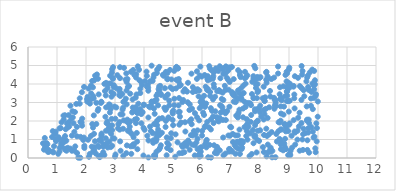
| Category | Series 0 |
|---|---|
| 6.514540313641692 | 0.25 |
| 3.258036223303853 | 2.355 |
| 9.611685176595932 | 2.788 |
| 6.718119250185469 | 2.056 |
| 3.560900860458809 | 0.226 |
| 9.434667183937016 | 4.973 |
| 9.293604395264447 | 1.469 |
| 2.3106375163464357 | 0.904 |
| 9.527382701474306 | 3.335 |
| 8.726764199824812 | 0.893 |
| 5.825327841776408 | 4.685 |
| 3.1801052760502415 | 3.356 |
| 1.8508317692140197 | 1.908 |
| 1000.0 | 1000 |
| 2.7900266712365154 | 1.78 |
| 7.911885719242525 | 3.995 |
| 5.846657293763941 | 3.717 |
| 7.2453509117797 | 2.362 |
| 2.072651007675997 | 0.986 |
| 7.290248872529956 | 2.613 |
| 3.8726823225385285 | 2.642 |
| 2.1349625093110856 | 2.94 |
| 4.938799020726297 | 1.337 |
| 1.2728139878986489 | 0.508 |
| 7.4158468451568815 | 2.201 |
| 1000.0 | 1000 |
| 9.66142939396353 | 1.606 |
| 9.600120747328019 | 4.144 |
| 4.246755495161998 | 2.842 |
| 4.922787181447119 | 1.071 |
| 4.590618096940318 | 3.41 |
| 6.416403614070068 | 3.818 |
| 5.556336335870954 | 0.84 |
| 2.8954090609565775 | 4.62 |
| 1.8686792845479105 | 2.127 |
| 1000.0 | 1000 |
| 2.9628327406106125 | 3.931 |
| 9.04494552154286 | 0.16 |
| 4.452664086378109 | 1.772 |
| 6.681659004231962 | 3.192 |
| 5.825778668973726 | 4.275 |
| 6.379328122886779 | 3.17 |
| 0.579129729845812 | 1.083 |
| 0.6876049098019399 | 0.331 |
| 1000.0 | 1000 |
| 3.871232251648208 | 3.512 |
| 3.8288889218697317 | 4.767 |
| 3.775248777607053 | 2.42 |
| 4.660409793697826 | 4.506 |
| 1000.0 | 1000 |
| 4.454933465504913 | 4.768 |
| 7.1762036709917805 | 0.581 |
| 2.9810257942731 | 1.051 |
| 1000.0 | 1000 |
| 5.003178958912086 | 1.778 |
| 7.9161145641658335 | 1.989 |
| 5.619706045245647 | 1.236 |
| 1000.0 | 1000 |
| 8.925193801852668 | 3.833 |
| 1000.0 | 1000 |
| 5.013668524437431 | 2.569 |
| 1000.0 | 1000 |
| 7.758082436355092 | 1.512 |
| 2.2690806493149953 | 2.302 |
| 3.541358059265891 | 0.631 |
| 7.892898900187163 | 3.235 |
| 1000.0 | 1000 |
| 8.896641847217783 | 0.48 |
| 3.9532553654040594 | 2.474 |
| 6.966066409401218 | 1.207 |
| 1000.0 | 1000 |
| 6.808218139456765 | 0.241 |
| 9.623420101642365 | 2.072 |
| 4.429543796718467 | 3.363 |
| 3.052163067318224 | 3.764 |
| 8.871622594810644 | 3.341 |
| 1000.0 | 1000 |
| 8.632051306754953 | 1.442 |
| 7.502352511373928 | 2.76 |
| 1000.0 | 1000 |
| 6.634056661532679 | 4.312 |
| 2.5329976426552725 | 3.005 |
| 3.740877927754135 | 3.434 |
| 5.686220917137559 | 3.568 |
| 3.3809819670199937 | 2.001 |
| 9.8960376760196 | 3.979 |
| 2.9307054772341754 | 4.279 |
| 8.228029484336398 | 0.088 |
| 2.2506429488890456 | 3.339 |
| 5.685380858201006 | 3.83 |
| 2.1715633291461134 | 1.191 |
| 7.654770253525554 | 1.328 |
| 8.399872269272793 | 1.399 |
| 2.6926859489544466 | 4.063 |
| 4.041003279543859 | 4.158 |
| 1.0608959885048153 | 1.024 |
| 6.711718383214096 | 3.533 |
| 2.454232472207053 | 0.958 |
| 0.8292543904805627 | 1.134 |
| 1.3782073640301062 | 1.663 |
| 6.588337880781211 | 3.66 |
| 3.653043263124766 | 0.73 |
| 9.686106286316482 | 3.676 |
| 8.85359167712618 | 1.797 |
| 1.9267528540206402 | 1.105 |
| 1000.0 | 1000 |
| 5.359114226030945 | 3.595 |
| 2.63489078296532 | 4.007 |
| 3.4679052299274113 | 1.873 |
| 6.1043733892131415 | 2.766 |
| 8.561822941673391 | 1.297 |
| 5.414003402297297 | 0.806 |
| 6.712299307437418 | 4.796 |
| 6.810480057490162 | 4.584 |
| 8.683702296176923 | 1.918 |
| 2.626913685242187 | 0.688 |
| 1000.0 | 1000 |
| 8.12736722713076 | 3.852 |
| 1.4089234324547706 | 1.942 |
| 5.045221637019969 | 3.201 |
| 7.7156233174318825 | 0.215 |
| 5.240193843390656 | 2.237 |
| 9.691128857250453 | 0.289 |
| 2.6246427155748844 | 0.709 |
| 5.506216551615943 | 3.014 |
| 5.848012588612992 | 0.477 |
| 1000.0 | 1000 |
| 4.559511935105263 | 3.897 |
| 7.036706938964193 | 3.558 |
| 7.130024140764714 | 0.681 |
| 6.943980034351408 | 2.769 |
| 8.483028087952224 | 3.253 |
| 2.9015591479718736 | 4.799 |
| 1000.0 | 1000 |
| 7.4375483032000735 | 3.512 |
| 8.507203204080842 | 3.145 |
| 1.3291151319703531 | 0.392 |
| 2.531101460166074 | 0.89 |
| 9.290065904599496 | 0.994 |
| 8.864440213556103 | 1.036 |
| 7.967733605172224 | 2.673 |
| 7.182201013032082 | 2.29 |
| 9.659340068282848 | 3.835 |
| 1000.0 | 1000 |
| 9.848716116556968 | 1.103 |
| 5.218818625873767 | 0.256 |
| 3.6867273387000665 | 2.078 |
| 1.4646692164385788 | 2.824 |
| 7.465627525975101 | 1.674 |
| 1000.0 | 1000 |
| 2.129740435931937 | 0.217 |
| 8.998576381001227 | 4.791 |
| 4.867270504674572 | 3.106 |
| 2.983964614326701 | 2.781 |
| 7.093316455840945 | 4.264 |
| 6.3464652420747765 | 2.548 |
| 9.202016896984315 | 4.42 |
| 6.895471794531911 | 4.239 |
| 6.264222998689867 | 0.707 |
| 1000.0 | 1000 |
| 4.82044853488968 | 4.284 |
| 1.8028459880965542 | 0.014 |
| 7.85060531830029 | 4.259 |
| 4.3543954767927655 | 3.08 |
| 7.063594628770513 | 1.299 |
| 1000.0 | 1000 |
| 1000.0 | 1000 |
| 4.147813707292426 | 3.636 |
| 2.4776869820574277 | 0.047 |
| 5.806915966917377 | 0.843 |
| 9.823055023263779 | 1.429 |
| 8.936965084795968 | 4.582 |
| 4.380535839575199 | 0.068 |
| 0.9544879582097587 | 1.424 |
| 7.914297933571 | 3.554 |
| 6.212698852102766 | 0.043 |
| 4.236206944368406 | 1.456 |
| 3.188035578879046 | 2.36 |
| 1000.0 | 1000 |
| 1000.0 | 1000 |
| 7.968309888299755 | 0.92 |
| 1000.0 | 1000 |
| 4.551455021510849 | 0.545 |
| 1.0871277109977606 | 1.604 |
| 5.93566228334256 | 0.555 |
| 3.6305060942906775 | 0.738 |
| 7.5685874340832395 | 0.99 |
| 8.282125300683639 | 0.318 |
| 5.080129334359851 | 0.069 |
| 8.22695800207018 | 4.066 |
| 4.32745277895061 | 4.357 |
| 5.1900322604879765 | 2.839 |
| 9.183193680717087 | 3.431 |
| 5.044480115368461 | 2.855 |
| 2.8992486127065775 | 1.509 |
| 1.5979403462377006 | 0.397 |
| 3.4015113763620084 | 4.113 |
| 1000.0 | 1000 |
| 7.030300307435878 | 4.919 |
| 5.776724905912203 | 1.266 |
| 4.680318558717148 | 4.443 |
| 0.9331551276336136 | 1.315 |
| 1.0430371045711961 | 0.225 |
| 3.8637399333534272 | 2.529 |
| 3.6200438204071617 | 2.524 |
| 6.163536174882916 | 0.979 |
| 0.7144950208958001 | 0.436 |
| 9.625427176227253 | 4.348 |
| 6.41934125486266 | 4.649 |
| 1000.0 | 1000 |
| 5.485324604742309 | 3.588 |
| 1000.0 | 1000 |
| 6.823739761555845 | 4.953 |
| 6.719900862978956 | 2.555 |
| 6.399390012197944 | 1.888 |
| 2.356510678143986 | 2.981 |
| 4.41154532265295 | 0.905 |
| 6.391364944535076 | 4.423 |
| 5.955075213295808 | 0.116 |
| 9.02473897776195 | 0.224 |
| 1000.0 | 1000 |
| 8.137386755633694 | 2.599 |
| 5.9567739569855895 | 0.341 |
| 3.1718929641161377 | 4.317 |
| 1.7838015784739347 | 2.937 |
| 6.270906933123551 | 4.242 |
| 5.845889803515922 | 1.494 |
| 8.241404398006035 | 1.191 |
| 9.95508216872793 | 0.897 |
| 1000.0 | 1000 |
| 7.095664108203753 | 3.046 |
| 3.4290357937433837 | 4.269 |
| 2.6688865298084496 | 2.229 |
| 6.543294061614979 | 0.499 |
| 4.7025456202294835 | 2.718 |
| 5.301733448824302 | 0.682 |
| 7.247550160782171 | 4.747 |
| 7.545310348943461 | 2.097 |
| 7.307451780532784 | 0.218 |
| 7.332142571232993 | 4.371 |
| 1.4947215984230477 | 2.129 |
| 6.143240497960162 | 2.944 |
| 0.8967386409265554 | 0.636 |
| 2.4368344431937086 | 3.439 |
| 7.664707222498533 | 2.956 |
| 1000.0 | 1000 |
| 6.74054164617933 | 0.146 |
| 2.0352448726717585 | 3.181 |
| 3.71327616995225 | 2.745 |
| 1000.0 | 1000 |
| 9.663890006803909 | 1.373 |
| 6.459865381903898 | 2.526 |
| 3.762144668001416 | 0.885 |
| 3.996319309304331 | 2.882 |
| 8.711038210874376 | 2.017 |
| 3.017206831126984 | 0.191 |
| 9.486145207419945 | 1.288 |
| 4.367661746456171 | 2.389 |
| 3.0806639127640323 | 4.476 |
| 4.798404682042131 | 0.538 |
| 7.860147931615403 | 1.915 |
| 6.3816719039158905 | 2.241 |
| 4.877253682173817 | 2.851 |
| 2.33862078462149 | 0.24 |
| 3.724900766705128 | 2.085 |
| 6.2735918978225405 | 4.832 |
| 5.910648101177124 | 0.074 |
| 9.93043456170236 | 3.444 |
| 4.481147686210333 | 4.812 |
| 9.820999612242465 | 2.643 |
| 5.830470793768743 | 2.202 |
| 1000.0 | 1000 |
| 1000.0 | 1000 |
| 1000.0 | 1000 |
| 7.15447996717555 | 0.226 |
| 5.159745400582453 | 4.833 |
| 2.6915173147839666 | 1.474 |
| 1000.0 | 1000 |
| 8.34470673158056 | 3.625 |
| 6.94182275503053 | 0.347 |
| 4.821484832978177 | 3.435 |
| 5.523232727882823 | 0.945 |
| 9.893856861453509 | 4.202 |
| 5.208489437091116 | 3.242 |
| 1.2806991897897213 | 0.448 |
| 8.224242214543965 | 4.657 |
| 8.64163376453481 | 1.934 |
| 6.038383613097386 | 2.453 |
| 7.7927000005170335 | 4.23 |
| 1.150259706234692 | 0.75 |
| 1000.0 | 1000 |
| 4.302377585368769 | 1.344 |
| 6.631966731170321 | 3.592 |
| 9.679259066702755 | 2.075 |
| 2.043555373403103 | 3.049 |
| 3.7229447155647954 | 1.885 |
| 8.367000429181433 | 0.56 |
| 5.3321003032338705 | 0.599 |
| 1000.0 | 1000 |
| 7.332485757335206 | 0.931 |
| 5.7188539551587105 | 1.453 |
| 6.474273480099159 | 4.844 |
| 1000.0 | 1000 |
| 3.48420569018135 | 3.891 |
| 1000.0 | 1000 |
| 5.750110339120952 | 0.692 |
| 6.976334313948312 | 0.454 |
| 7.371194537192962 | 3.439 |
| 4.098172594941047 | 4.437 |
| 8.852529477733437 | 1.84 |
| 3.410123841095598 | 0.68 |
| 6.954289928328272 | 4.111 |
| 1000.0 | 1000 |
| 7.855765397749956 | 4.257 |
| 5.643888866368334 | 1.824 |
| 9.990744768019354 | 2.231 |
| 1.5128956668273696 | 1.208 |
| 3.93388917086809 | 3.95 |
| 1000.0 | 1000 |
| 5.921630233792862 | 2.695 |
| 2.1725198348733743 | 3.909 |
| 1.3423772247763188 | 1.867 |
| 4.484015765399862 | 2.846 |
| 1000.0 | 1000 |
| 7.776164515706685 | 0.798 |
| 9.19151780647466 | 1.434 |
| 1000.0 | 1000 |
| 4.801627071903875 | 0.823 |
| 9.848113686434678 | 3.927 |
| 9.632829366969023 | 0.435 |
| 9.193343354852173 | 2.681 |
| 4.545725821500337 | 1.291 |
| 9.36594439407828 | 2.445 |
| 5.266191773828888 | 3.949 |
| 7.838992140334514 | 1.197 |
| 1000.0 | 1000 |
| 9.61789981577809 | 2.019 |
| 8.261439886375273 | 4.416 |
| 7.802275845440008 | 4.978 |
| 8.810940513478846 | 2.344 |
| 1000.0 | 1000 |
| 1000.0 | 1000 |
| 5.8448672464615115 | 1.037 |
| 3.6238560780121643 | 0.637 |
| 8.83875381340874 | 0.773 |
| 4.911861901838694 | 3.816 |
| 3.4019592583251033 | 2.901 |
| 5.1930736472680685 | 2.48 |
| 1000.0 | 1000 |
| 8.003325289158044 | 2.466 |
| 3.550955562387773 | 4.66 |
| 5.222423120304373 | 3.892 |
| 4.3803315809945715 | 3.074 |
| 1000.0 | 1000 |
| 2.8749578887028546 | 3.563 |
| 9.00954510703923 | 1.805 |
| 2.2815319103560796 | 4.198 |
| 1.8589885743263257 | 3.555 |
| 7.478890724353494 | 3.027 |
| 5.197220392025122 | 4.268 |
| 7.882079933877385 | 0.3 |
| 4.785195511697403 | 1.115 |
| 8.229990341659354 | 4.204 |
| 9.481755710453035 | 0.436 |
| 1000.0 | 1000 |
| 4.155163877615523 | 0.947 |
| 5.985117269969175 | 2.812 |
| 1000.0 | 1000 |
| 2.4045716868712583 | 2.555 |
| 5.794371801498438 | 3.613 |
| 1000.0 | 1000 |
| 5.100461762520299 | 4.887 |
| 5.517294853772071 | 4.066 |
| 8.62337746160611 | 4.568 |
| 1000.0 | 1000 |
| 9.993747789134206 | 3.054 |
| 4.451363117371424 | 1.339 |
| 1.8653586643806797 | 1.746 |
| 3.3976129104142636 | 3.649 |
| 1.597530083334503 | 1.411 |
| 2.9247422389931224 | 1.069 |
| 3.8044481382731243 | 2.935 |
| 1000.0 | 1000 |
| 2.8454326378790995 | 2.635 |
| 0.6691587948883027 | 0.742 |
| 6.391924342224485 | 4.656 |
| 4.843147185309907 | 2.152 |
| 9.213663530744414 | 0.725 |
| 8.888515432361721 | 1.73 |
| 3.389295265588336 | 4.572 |
| 6.098486295088654 | 1.674 |
| 5.276805542338191 | 1.919 |
| 8.992293380357658 | 2.507 |
| 5.750902091777567 | 0.141 |
| 2.8216141431772956 | 2.875 |
| 6.0017367785585085 | 1.211 |
| 1000.0 | 1000 |
| 1.5137523090646887 | 0.39 |
| 9.942339834454698 | 1.875 |
| 7.417022082745534 | 2.674 |
| 7.772842904376491 | 4.423 |
| 3.612112896544982 | 2.728 |
| 9.916404290672297 | 3.361 |
| 6.526206393716296 | 3.604 |
| 9.429583205640709 | 1.889 |
| 6.11024455491199 | 0.742 |
| 7.400770034237737 | 0.905 |
| 8.216943695766492 | 4.238 |
| 2.7965680801615314 | 2.801 |
| 9.428145298580276 | 3.14 |
| 1000.0 | 1000 |
| 7.292869346962921 | 1.535 |
| 1.0953288674330153 | 0.547 |
| 2.426164801467212 | 2.653 |
| 4.524273077650355 | 2.13 |
| 6.120912075072845 | 1.736 |
| 9.18136628560243 | 3.23 |
| 2.532538135257576 | 1.252 |
| 3.625433430757715 | 4.758 |
| 6.251216382244198 | 4.964 |
| 9.159375376729873 | 2.045 |
| 1000.0 | 1000 |
| 7.92225473007978 | 2.654 |
| 4.94739304736599 | 4.246 |
| 5.883000750286059 | 3.33 |
| 3.1061163061557693 | 1.6 |
| 1000.0 | 1000 |
| 7.934239028134008 | 3.626 |
| 8.724029758113156 | 0.478 |
| 6.038238049857735 | 2.973 |
| 1.088255380925739 | 0.349 |
| 2.2647002554373366 | 3.225 |
| 4.719760991873817 | 3.772 |
| 4.144153920804195 | 3.798 |
| 2.6332343460393837 | 0.161 |
| 1.6178097755352572 | 2.485 |
| 2.198064178238086 | 0.611 |
| 2.246388612894501 | 0.353 |
| 4.526143397310761 | 1.238 |
| 7.370068755906996 | 3.161 |
| 7.5634819412285434 | 4.465 |
| 8.134913644347938 | 0.323 |
| 3.7513531518291154 | 1.356 |
| 7.153047281873003 | 1.221 |
| 2.438404582255579 | 0.086 |
| 5.102520807874495 | 3.76 |
| 8.676149734853674 | 1.033 |
| 9.160756959725987 | 3.895 |
| 7.77511674733937 | 3.234 |
| 7.3126028949046775 | 0.784 |
| 1000.0 | 1000 |
| 4.265516784529528 | 3.038 |
| 6.093954121144587 | 4.486 |
| 4.020414590051057 | 1.524 |
| 7.421340141562386 | 3.903 |
| 1.2327160071735843 | 2.079 |
| 9.867915486132105 | 4.707 |
| 8.737187801379068 | 3.246 |
| 4.780560604598476 | 0.147 |
| 8.710846180635837 | 1.547 |
| 9.867204301409426 | 3.718 |
| 9.919052296363692 | 0.313 |
| 8.8899861854347 | 1.441 |
| 3.288723180164299 | 3.035 |
| 3.666606055257511 | 4.491 |
| 7.839313199469372 | 4.851 |
| 2.93432063017197 | 4.91 |
| 7.554513202457955 | 1.828 |
| 4.802460769707334 | 4.257 |
| 6.1501400984532815 | 0.573 |
| 1000.0 | 1000 |
| 3.9092159141230445 | 1.876 |
| 6.643729626311099 | 2.45 |
| 9.108035441854273 | 0.559 |
| 1.6648785804134192 | 2.923 |
| 2.3770568078292764 | 4.515 |
| 1.9337343234559734 | 3.842 |
| 5.637234837005489 | 4.559 |
| 4.115149888418496 | 1.202 |
| 3.904265513414157 | 2.375 |
| 1000.0 | 1000 |
| 7.927140550005194 | 1.471 |
| 1.6882461532318405 | 1.172 |
| 1000.0 | 1000 |
| 3.1774048513833764 | 0.899 |
| 5.680638407100113 | 1.216 |
| 8.007058358184846 | 1.497 |
| 2.821650081287367 | 1.575 |
| 9.013965941736261 | 3.796 |
| 3.1570100757823827 | 3.605 |
| 1000.0 | 1000 |
| 3.440544034466264 | 1.473 |
| 8.127271047730495 | 2.081 |
| 7.050854723961548 | 3.464 |
| 2.4452055976173384 | 0.598 |
| 1.80982614476338 | 1.953 |
| 1.687693211754655 | 1.682 |
| 2.5954215763514465 | 0.313 |
| 4.297942774185888 | 4.167 |
| 7.257058687233062 | 3.198 |
| 3.310387544310418 | 4.872 |
| 9.154460827792217 | 3.856 |
| 6.1275117351814155 | 3.851 |
| 7.916547724499319 | 2.017 |
| 8.15694660148163 | 3.096 |
| 1.054581208178751 | 1.054 |
| 3.898384417023535 | 4.122 |
| 1000.0 | 1000 |
| 2.4125312702599166 | 4.282 |
| 5.3915856327208855 | 0.311 |
| 8.17915523314131 | 3.281 |
| 8.357384106579417 | 3.321 |
| 1000.0 | 1000 |
| 7.47637359773273 | 4.313 |
| 5.1747036016131425 | 4.851 |
| 1000.0 | 1000 |
| 1000.0 | 1000 |
| 2.597298058036296 | 0.611 |
| 6.17298411321083 | 3.688 |
| 8.827103444167498 | 2.78 |
| 7.676310559929539 | 1.952 |
| 7.046942656077171 | 0.349 |
| 2.824344023949755 | 2.46 |
| 2.8469644382830674 | 4.031 |
| 8.878514706045483 | 4.487 |
| 1000.0 | 1000 |
| 7.691048578308904 | 2.857 |
| 3.7862936001086824 | 4.954 |
| 8.983642249820438 | 3.938 |
| 1000.0 | 1000 |
| 0.6396430935566699 | 0.807 |
| 9.78054165765431 | 3.567 |
| 5.944020921533207 | 4.938 |
| 2.6822679117858215 | 1.065 |
| 1.545275444741031 | 2.196 |
| 8.622986786106614 | 4.945 |
| 7.80406731158709 | 1.223 |
| 4.4335068783290845 | 3.145 |
| 7.069715247301182 | 0.86 |
| 4.897193608231383 | 4.761 |
| 1.3716063337318107 | 0.551 |
| 2.896559774070766 | 1.769 |
| 9.77281777683055 | 1.666 |
| 3.159660315821534 | 3.733 |
| 1.2015805747819408 | 0.821 |
| 0.7251526458453283 | 0.34 |
| 3.278483962989942 | 1.583 |
| 1000.0 | 1000 |
| 7.104886741576245 | 3.361 |
| 3.599689196227027 | 1.27 |
| 8.936970624167206 | 3.363 |
| 2.516317137283044 | 0.14 |
| 8.754617009828978 | 3.125 |
| 9.962423243946368 | 1.62 |
| 1000.0 | 1000 |
| 1000.0 | 1000 |
| 5.1964486822132905 | 4.126 |
| 1000.0 | 1000 |
| 6.942456178845146 | 4.901 |
| 1000.0 | 1000 |
| 3.9798703453791417 | 0.133 |
| 0.9660386035829827 | 0.912 |
| 7.502330038892256 | 4.02 |
| 8.308420594798077 | 1.276 |
| 3.5079063406498134 | 1.693 |
| 9.018772905660684 | 1.867 |
| 3.1619149634159083 | 1.534 |
| 6.312114971423158 | 2.098 |
| 3.280406114727522 | 2.72 |
| 4.262322608121282 | 4.99 |
| 8.725150761304116 | 2.404 |
| 8.53397491995067 | 0.042 |
| 2.682491367872487 | 0.724 |
| 6.1808956522292835 | 1.954 |
| 5.322760270980663 | 3.021 |
| 1000.0 | 1000 |
| 3.1165925537688413 | 1.824 |
| 2.8795101916864496 | 3.314 |
| 1000.0 | 1000 |
| 1.2250107634709406 | 1.02 |
| 8.041386333667749 | 2.237 |
| 3.390713415885104 | 0.26 |
| 7.734720839643412 | 4.122 |
| 8.418015731024349 | 0.036 |
| 0.9444060699835222 | 1.311 |
| 2.899280795165212 | 0.66 |
| 9.507949694965683 | 3.662 |
| 7.8114216232541365 | 1.146 |
| 1000.0 | 1000 |
| 4.130878318828178 | 3.954 |
| 1000.0 | 1000 |
| 1.3217792532368233 | 0.935 |
| 9.467254834272186 | 4.704 |
| 1.5700974003174328 | 1.881 |
| 1000.0 | 1000 |
| 8.21763571661273 | 1.584 |
| 1000.0 | 1000 |
| 6.071367193300111 | 3.361 |
| 1000.0 | 1000 |
| 2.6557295704571473 | 3.618 |
| 7.36543237538327 | 0.77 |
| 4.219156771503924 | 4.152 |
| 1000.0 | 1000 |
| 1000.0 | 1000 |
| 6.278818826990794 | 3.565 |
| 8.511790731888624 | 2.802 |
| 6.736240565278764 | 3.136 |
| 6.735387349953658 | 4.549 |
| 4.51985820162582 | 0.457 |
| 3.424918445262052 | 2.076 |
| 6.4043073011317215 | 3.984 |
| 6.808718535505652 | 2.415 |
| 2.7787263030198806 | 4.014 |
| 1000.0 | 1000 |
| 2.525984394438272 | 3.041 |
| 1.4618874641865498 | 0.508 |
| 3.155100237645688 | 1.945 |
| 5.99228549044994 | 3.095 |
| 4.265277050702652 | 3.048 |
| 4.343702950169841 | 2.675 |
| 1000.0 | 1000 |
| 8.525450982408344 | 2.874 |
| 8.486445952752407 | 4.346 |
| 4.431500383402095 | 1.134 |
| 1000.0 | 1000 |
| 8.01707889082486 | 4.371 |
| 2.179531682866387 | 3.186 |
| 4.767148171856536 | 3.356 |
| 6.178848330868765 | 4.381 |
| 7.261568749988988 | 2.459 |
| 5.950805441243966 | 3.028 |
| 7.243076325835797 | 3.654 |
| 1000.0 | 1000 |
| 8.202732257817912 | 2.659 |
| 8.55145859633141 | 2.805 |
| 3.0119091686193444 | 2.123 |
| 6.934930476555819 | 0.488 |
| 6.3758467350532255 | 4.291 |
| 1000.0 | 1000 |
| 8.690155317892431 | 3.179 |
| 1.2776679312092043 | 1.185 |
| 1000.0 | 1000 |
| 9.341803686933774 | 1.705 |
| 6.327221264605183 | 4.742 |
| 4.735293749918039 | 3.266 |
| 6.18573621642872 | 4.278 |
| 1.300738761889989 | 1.554 |
| 3.1724612848244096 | 4.908 |
| 6.564780814035361 | 4.705 |
| 1.533420480718829 | 2.528 |
| 6.198824408056293 | 3.74 |
| 1000.0 | 1000 |
| 8.91764020253578 | 4.658 |
| 1000.0 | 1000 |
| 1000.0 | 1000 |
| 6.548526706327655 | 2.014 |
| 1000.0 | 1000 |
| 8.929047591337905 | 3.069 |
| 5.575463459810678 | 0.443 |
| 7.829388738337762 | 1.772 |
| 8.540047899363742 | 2.964 |
| 2.916073549571665 | 4.338 |
| 1000.0 | 1000 |
| 3.1925574937417633 | 0.392 |
| 1000.0 | 1000 |
| 8.268944004948876 | 0.726 |
| 6.498592351282191 | 2.209 |
| 5.991132148282608 | 3.067 |
| 9.453069308739746 | 4.507 |
| 6.6049024597498915 | 2.167 |
| 9.054321635756459 | 0.392 |
| 9.37422311068177 | 3.884 |
| 3.874195991975612 | 3.743 |
| 8.391982187075701 | 4.268 |
| 3.7721865942335486 | 0.475 |
| 7.206517659598356 | 0.873 |
| 7.722467345942833 | 3.455 |
| 1.6291896748399315 | 0.627 |
| 8.716609583351305 | 0.732 |
| 0.5889943474936787 | 0.6 |
| 4.984037351971432 | 2.49 |
| 9.566306289297874 | 1.35 |
| 3.0473616074413066 | 2.731 |
| 1.421198278883652 | 1.711 |
| 8.1560547864761 | 2.37 |
| 6.145620844729197 | 0.904 |
| 8.161477494597392 | 3.075 |
| 5.65538656128239 | 2.663 |
| 7.856128505160251 | 3.979 |
| 9.907310824536097 | 0.522 |
| 2.7474046613377556 | 0.569 |
| 2.3139897024277833 | 4.45 |
| 5.352932503288192 | 3.133 |
| 4.382705970198187 | 0.108 |
| 1000.0 | 1000 |
| 4.854622555248947 | 0.718 |
| 8.972024956205399 | 0.157 |
| 8.426601193057254 | 0.382 |
| 4.152606426072101 | 0.032 |
| 5.08919164055384 | 1.278 |
| 2.2166363081580345 | 1.834 |
| 5.981941813902054 | 0.585 |
| 8.583877053711856 | 0.893 |
| 1000.0 | 1000 |
| 4.629437243666574 | 2.158 |
| 5.5701004166210675 | 1.99 |
| 1.1521040712186592 | 0.626 |
| 1000.0 | 1000 |
| 6.954050867884462 | 0.45 |
| 4.916935700312957 | 0.424 |
| 2.791933279849909 | 1.626 |
| 6.310187191917924 | 0.022 |
| 3.7242999268256325 | 2.593 |
| 4.432493904740429 | 1.003 |
| 6.5862507471596645 | 3.654 |
| 2.682032332932125 | 3.38 |
| 2.2118801456091095 | 4.163 |
| 8.355829781408842 | 0.337 |
| 3.490596876050099 | 1.504 |
| 1000.0 | 1000 |
| 2.3565842520341196 | 1.838 |
| 8.362298746677912 | 0.494 |
| 0.8547532980838979 | 0.348 |
| 9.856878002590083 | 3.248 |
| 0.5519415893125423 | 0.45 |
| 2.798879299975381 | 2.895 |
| 1000.0 | 1000 |
| 4.316987425429458 | 0.82 |
| 4.5222257413122335 | 3.859 |
| 5.120980375537943 | 4.928 |
| 9.635232141225178 | 0.956 |
| 5.6681402858199625 | 0.72 |
| 9.310776378835946 | 4.334 |
| 8.007651824855671 | 2.828 |
| 2.5087956601759043 | 0.984 |
| 4.451884937829274 | 2.01 |
| 8.212556786803724 | 4.623 |
| 8.4957472356412 | 2.662 |
| 1000.0 | 1000 |
| 6.730064695917775 | 4.843 |
| 0.5173395852282447 | 0.792 |
| 3.5332530279836094 | 1.373 |
| 1000.0 | 1000 |
| 7.482054279019778 | 4.657 |
| 1000.0 | 1000 |
| 6.805585638891754 | 3.673 |
| 1000.0 | 1000 |
| 8.971786866779706 | 1.457 |
| 3.7471096197852463 | 2.472 |
| 5.426669146513717 | 1.431 |
| 1000.0 | 1000 |
| 1.0554145066547993 | 1.123 |
| 8.689434993447826 | 3.824 |
| 9.647979130115157 | 4.451 |
| 1000.0 | 1000 |
| 4.993731806904248 | 2.404 |
| 3.992464528655264 | 2.859 |
| 3.7138738597857435 | 3.264 |
| 5.155767942085862 | 0.846 |
| 3.2970919464632176 | 2.035 |
| 9.757473290920668 | 3.219 |
| 9.025430459828357 | 3.095 |
| 1000.0 | 1000 |
| 6.611982034902782 | 4.959 |
| 6.703507251027297 | 2.738 |
| 9.801805853495985 | 4.779 |
| 2.539954810775619 | 1.323 |
| 2.886425311817946 | 2.113 |
| 2.763769228719469 | 1.474 |
| 3.363502354343395 | 4.24 |
| 1.149476084775215 | 0.792 |
| 7.409211108043317 | 0.84 |
| 9.316080187847259 | 2.176 |
| 7.825470359145808 | 2.632 |
| 4.526796405723865 | 4.926 |
| 5.992535690234776 | 3.217 |
| 5.628213608739475 | 2.09 |
| 9.43812578433253 | 3.776 |
| 7.110942404438107 | 3.469 |
| 9.460386383146911 | 1.001 |
| 8.093899203369666 | 3.229 |
| 7.307884530657962 | 4.481 |
| 6.008752859683733 | 3.058 |
| 6.304075214794757 | 2.694 |
| 1.275418203248686 | 2.309 |
| 2.9571158395085053 | 3.833 |
| 1000.0 | 1000 |
| 2.7096874639026147 | 1.882 |
| 2.5106777496971677 | 2.98 |
| 6.305208568145187 | 1.54 |
| 1000.0 | 1000 |
| 1.9043262823922336 | 0.971 |
| 8.809108959346824 | 3.875 |
| 4.534386854120016 | 3.669 |
| 1.7352625713551695 | 0.016 |
| 2.832579024604195 | 4.446 |
| 7.384075762877592 | 0.565 |
| 7.5440612208092395 | 1.463 |
| 1000.0 | 1000 |
| 2.2766549061683983 | 1.307 |
| 1000.0 | 1000 |
| 3.9266435470146765 | 2.445 |
| 1000.0 | 1000 |
| 2.239182651190198 | 3.819 |
| 1000.0 | 1000 |
| 5.90593877439038 | 0.205 |
| 3.9840106893037808 | 1.63 |
| 4.755740248500459 | 4.652 |
| 6.578545559934898 | 1.977 |
| 7.526983737440637 | 1.19 |
| 8.930865210466147 | 3.587 |
| 7.235334532417696 | 1.221 |
| 8.678908879466702 | 3.447 |
| 6.854963820833926 | 4.34 |
| 3.730164497814372 | 4.528 |
| 6.821398582878574 | 2.052 |
| 9.010966805417613 | 4.884 |
| 2.413224197658721 | 0.659 |
| 1000.0 | 1000 |
| 6.518481788467549 | 0.601 |
| 2.178524372851883 | 3.489 |
| 1.9434185305331686 | 0.543 |
| 5.112630283270848 | 4.229 |
| 4.740304534691921 | 2.6 |
| 5.901355650361872 | 2.032 |
| 7.978100891473888 | 4.319 |
| 8.925068816136516 | 3.606 |
| 7.6014916662208885 | 1.688 |
| 4.4301853612399515 | 0.342 |
| 1.6931506262485307 | 0.266 |
| 1000.0 | 1000 |
| 3.6067425224726812 | 3.166 |
| 5.9048551816374975 | 3.645 |
| 1.813259330198076 | 1.144 |
| 2.9998759171928704 | 0.078 |
| 8.102485629932588 | 0.588 |
| 6.866196187750302 | 2.533 |
| 8.263303047134977 | 2.164 |
| 5.2178777149435955 | 1.801 |
| 7.306205770342452 | 4.635 |
| 9.369467939242384 | 0.397 |
| 5.566739247624523 | 2.592 |
| 3.4428559077516816 | 3.834 |
| 4.3562609945544075 | 0.056 |
| 1000.0 | 1000 |
| 7.908423105962035 | 0.975 |
| 7.8279489619899065 | 2.525 |
| 4.171545167354653 | 2.783 |
| 3.5233351669387734 | 3.477 |
| 6.787249138970413 | 3.9 |
| 6.416400922083481 | 0.688 |
| 5.988149949427404 | 4.401 |
| 4.985903497021886 | 2.064 |
| 8.317199547751132 | 2.74 |
| 3.3203624595187167 | 3.072 |
| 9.026728064756632 | 4.02 |
| 9.69587240965707 | 1.883 |
| 3.530413841500246 | 1.982 |
| 3.285963612064201 | 0.113 |
| 4.470298021881993 | 3.471 |
| 1000.0 | 1000 |
| 6.070524220935924 | 2.327 |
| 2.5339378145882216 | 1.172 |
| 4.097275927646608 | 3.865 |
| 9.876933753105213 | 1.158 |
| 0.8543727532962475 | 1.454 |
| 7.594642581652237 | 2.98 |
| 5.4099405432121035 | 3.717 |
| 9.0912453097083 | 1.2 |
| 5.7568038356696905 | 2.422 |
| 7.908691088395924 | 4.382 |
| 5.577688473287723 | 2.899 |
| 1000.0 | 1000 |
| 6.23908781487997 | 1.659 |
| 2.807060847088273 | 0.884 |
| 5.918528238082249 | 4.46 |
| 3.752522359769457 | 2.103 |
| 6.892557455211177 | 4.712 |
| 4.984629806248154 | 3.725 |
| 8.715170640554511 | 2.791 |
| 7.697061259399973 | 2.321 |
| 9.757542769323228 | 2.82 |
| 4.212792719690942 | 2.737 |
| 2.8641099073772125 | 1.307 |
| 1000.0 | 1000 |
| 9.498798517983829 | 1.588 |
| 5.230409659853432 | 2.499 |
| 3.250426505684809 | 3.456 |
| 7.781129565788846 | 3.25 |
| 6.202336412742663 | 4.202 |
| 7.0061929337511355 | 1.663 |
| 8.855496114229508 | 0.602 |
| 7.251817185441817 | 0.496 |
| 1000.0 | 1000 |
| 1000.0 | 1000 |
| 1000.0 | 1000 |
| 6.613120021191577 | 0.41 |
| 6.624876226588032 | 2.856 |
| 2.2833735061565843 | 0.582 |
| 6.974149451263376 | 1.684 |
| 2.6936680733734084 | 2.739 |
| 3.7276231609087507 | 4.349 |
| 4.658533541938573 | 4.478 |
| 7.192554731129794 | 3.265 |
| 1.942798942521794 | 0.654 |
| 6.451102612706635 | 3.312 |
| 4.805470778651454 | 4.591 |
| 5.3145388542960115 | 0.268 |
| 3.592471425308056 | 2.46 |
| 6.942116033246009 | 4.825 |
| 4.502939713919551 | 3.722 |
| 8.987990915024174 | 3.078 |
| 4.209414203383829 | 1.697 |
| 1000.0 | 1000 |
| 7.8616757828511385 | 3.787 |
| 5.467016645628233 | 0.653 |
| 7.640083742244067 | 0.101 |
| 1000.0 | 1000 |
| 2.7383279963843465 | 1.974 |
| 4.7436074349398405 | 1.678 |
| 8.97392452464122 | 4.059 |
| 4.8416489692396745 | 2.194 |
| 7.161859691947053 | 3.021 |
| 4.441763998516332 | 4.588 |
| 4.579831549681876 | 0.687 |
| 7.366707057407444 | 0.482 |
| 9.211975039847683 | 1.373 |
| 7.510587404175048 | 4.354 |
| 5.414718233686372 | 1.933 |
| 6.502238445822393 | 0.427 |
| 8.529792491125523 | 3.12 |
| 1000.0 | 1000 |
| 4.384633789313362 | 0.168 |
| 6.671258819637505 | 2.804 |
| 4.753856707921149 | 2.004 |
| 4.343248246434368 | 0.143 |
| 1000.0 | 1000 |
| 4.573452389496967 | 3.48 |
| 0.9493007841653156 | 1.016 |
| 4.320674494109083 | 0.955 |
| 1000.0 | 1000 |
| 8.916196429359783 | 4.145 |
| 1.223572674827953 | 2.291 |
| 6.204712531948823 | 3.662 |
| 1000.0 | 1000 |
| 1000.0 | 1000 |
| 7.237936958462145 | 2.19 |
| 1.1257511073584825 | 1.617 |
| 1000.0 | 1000 |
| 5.0430858720785485 | 4.71 |
| 0.6218152205667515 | 0.614 |
| 1000.0 | 1000 |
| 3.6400102654481357 | 1.129 |
| 2.102692288429042 | 0.064 |
| 1.7846870460245645 | 3.225 |
| 2.9530159174439174 | 3.462 |
| 4.350249285553579 | 1.838 |
| 6.9094694653185815 | 1.215 |
| 8.138881727852725 | 1.246 |
| 9.808150884221325 | 4.028 |
| 1.1576832086967515 | 1.926 |
| 5.788417340746248 | 3.671 |
| 4.48790948272743 | 1.534 |
| 7.774605957428664 | 4.293 |
| 6.916584290336415 | 3.691 |
| 7.352336033218874 | 3.241 |
| 8.798917499944597 | 0.416 |
| 2.7194884309518774 | 0.799 |
| 8.742341915459818 | 1.538 |
| 1000.0 | 1000 |
| 7.2870344384331895 | 3.49 |
| 4.615609178654363 | 1.364 |
| 4.150182028655017 | 2.19 |
| 2.282304405410919 | 0.429 |
| 6.729685843083715 | 1.107 |
| 3.841307606290718 | 4.203 |
| 2.8542397718645462 | 0.588 |
| 9.716297418632053 | 4.625 |
| 4.086679232257897 | 4.668 |
| 2.088448991682993 | 3.75 |
| 2.052920862442801 | 3.302 |
| 8.904600350223044 | 1.657 |
| 1.2595909988578913 | 0.885 |
| 7.341698050148533 | 3.763 |
| 3.149530550435448 | 3.393 |
| 6.005971910252831 | 1.462 |
| 1.4035836391713907 | 2.318 |
| 6.202368495800154 | 4.423 |
| 4.769777809906842 | 2.697 |
| 3.373338220576273 | 3.207 |
| 6.281419896452535 | 3.355 |
| 0.8710888329164657 | 0.304 |
| 3.2606991497352658 | 2.615 |
| 4.348516827335817 | 4.503 |
| 6.445593412872281 | 0.275 |
| 2.2423425607632286 | 1.643 |
| 2.7425548366080776 | 3.78 |